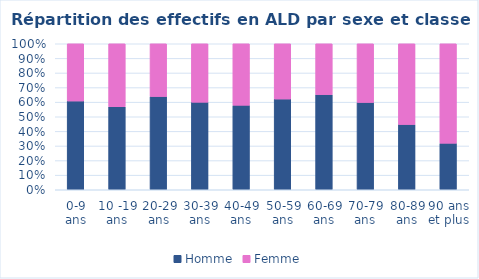
| Category | Homme | Femme |
|---|---|---|
| 0-9 ans | 0.608 | 0.392 |
| 10 -19 ans | 0.569 | 0.431 |
| 20-29 ans | 0.639 | 0.361 |
| 30-39 ans | 0.6 | 0.4 |
| 40-49 ans | 0.579 | 0.421 |
| 50-59 ans | 0.622 | 0.378 |
| 60-69 ans | 0.652 | 0.348 |
| 70-79 ans | 0.598 | 0.402 |
| 80-89 ans | 0.447 | 0.553 |
| 90 ans et plus | 0.319 | 0.681 |